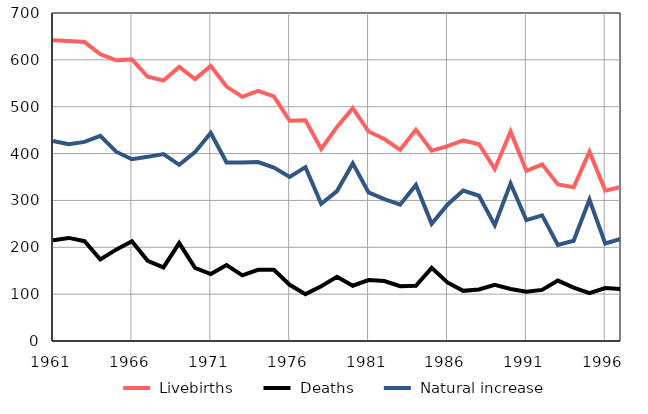
| Category |  Livebirths |  Deaths |  Natural increase |
|---|---|---|---|
| 1961.0 | 642 | 215 | 427 |
| 1962.0 | 640 | 220 | 420 |
| 1963.0 | 638 | 213 | 425 |
| 1964.0 | 612 | 174 | 438 |
| 1965.0 | 599 | 195 | 404 |
| 1966.0 | 601 | 213 | 388 |
| 1967.0 | 564 | 171 | 393 |
| 1968.0 | 556 | 157 | 399 |
| 1969.0 | 585 | 209 | 376 |
| 1970.0 | 559 | 156 | 403 |
| 1971.0 | 587 | 143 | 444 |
| 1972.0 | 543 | 162 | 381 |
| 1973.0 | 521 | 140 | 381 |
| 1974.0 | 534 | 152 | 382 |
| 1975.0 | 522 | 152 | 370 |
| 1976.0 | 470 | 120 | 350 |
| 1977.0 | 471 | 100 | 371 |
| 1978.0 | 410 | 117 | 293 |
| 1979.0 | 457 | 137 | 320 |
| 1980.0 | 497 | 118 | 379 |
| 1981.0 | 447 | 130 | 317 |
| 1982.0 | 431 | 128 | 303 |
| 1983.0 | 408 | 117 | 291 |
| 1984.0 | 451 | 118 | 333 |
| 1985.0 | 406 | 156 | 250 |
| 1986.0 | 416 | 125 | 291 |
| 1987.0 | 428 | 107 | 321 |
| 1988.0 | 420 | 110 | 310 |
| 1989.0 | 367 | 120 | 247 |
| 1990.0 | 447 | 111 | 336 |
| 1991.0 | 363 | 105 | 258 |
| 1992.0 | 377 | 109 | 268 |
| 1993.0 | 334 | 129 | 205 |
| 1994.0 | 328 | 114 | 214 |
| 1995.0 | 404 | 102 | 302 |
| 1996.0 | 321 | 113 | 208 |
| 1997.0 | 329 | 111 | 218 |